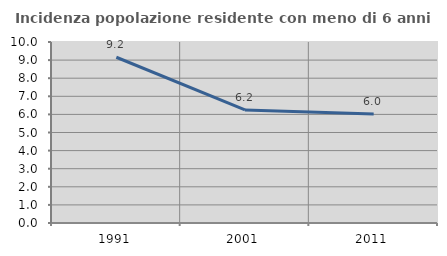
| Category | Incidenza popolazione residente con meno di 6 anni |
|---|---|
| 1991.0 | 9.158 |
| 2001.0 | 6.246 |
| 2011.0 | 6.028 |